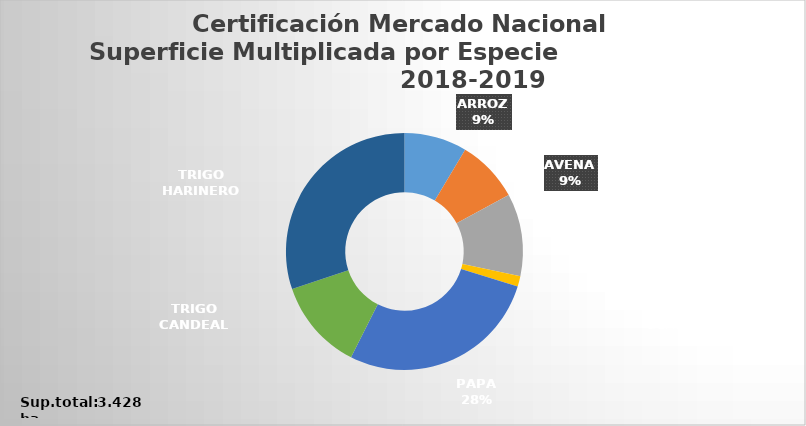
| Category | Series 0 |
|---|---|
| ARROZ | 278.98 |
| AVENA | 278.54 |
| CEBADA | 367.3 |
| LUPINO BLANCO | 46.4 |
| PAPA | 902.016 |
| TRIGO CANDEAL | 404.6 |
| TRIGO HARINERO | 982.696 |